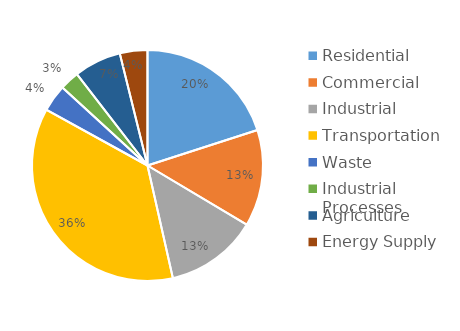
| Category | Series 0 |
|---|---|
| Residential | 1974077.785 |
| Commercial | 1333058.581 |
| Industrial | 1271887.767 |
| Transportation | 3601351.609 |
| Waste | 372982.493 |
| Industrial Processes | 268580.894 |
| Agriculture | 651388.568 |
| Energy Supply | 380242.97 |